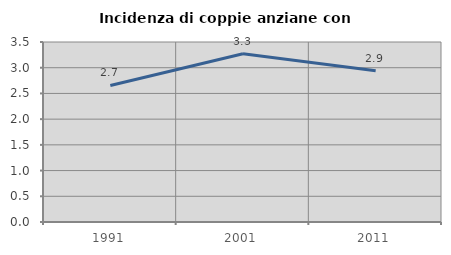
| Category | Incidenza di coppie anziane con figli |
|---|---|
| 1991.0 | 2.655 |
| 2001.0 | 3.273 |
| 2011.0 | 2.941 |